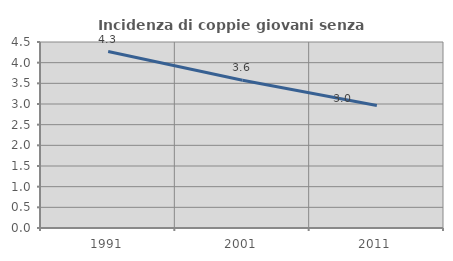
| Category | Incidenza di coppie giovani senza figli |
|---|---|
| 1991.0 | 4.268 |
| 2001.0 | 3.575 |
| 2011.0 | 2.965 |